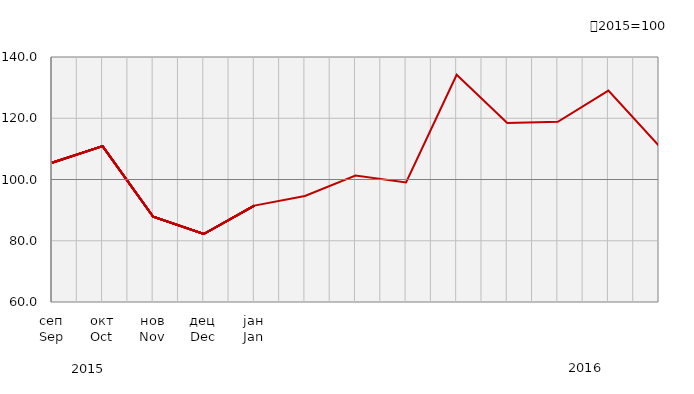
| Category | Индекси ноћења туриста
Tourist night indices |
|---|---|
| сеп
Sep | 105.466 |
| окт
Oct | 110.883 |
| нов
Nov | 87.836 |
| дец
Dec | 82.203 |
| јан
Jan | 91.47 |